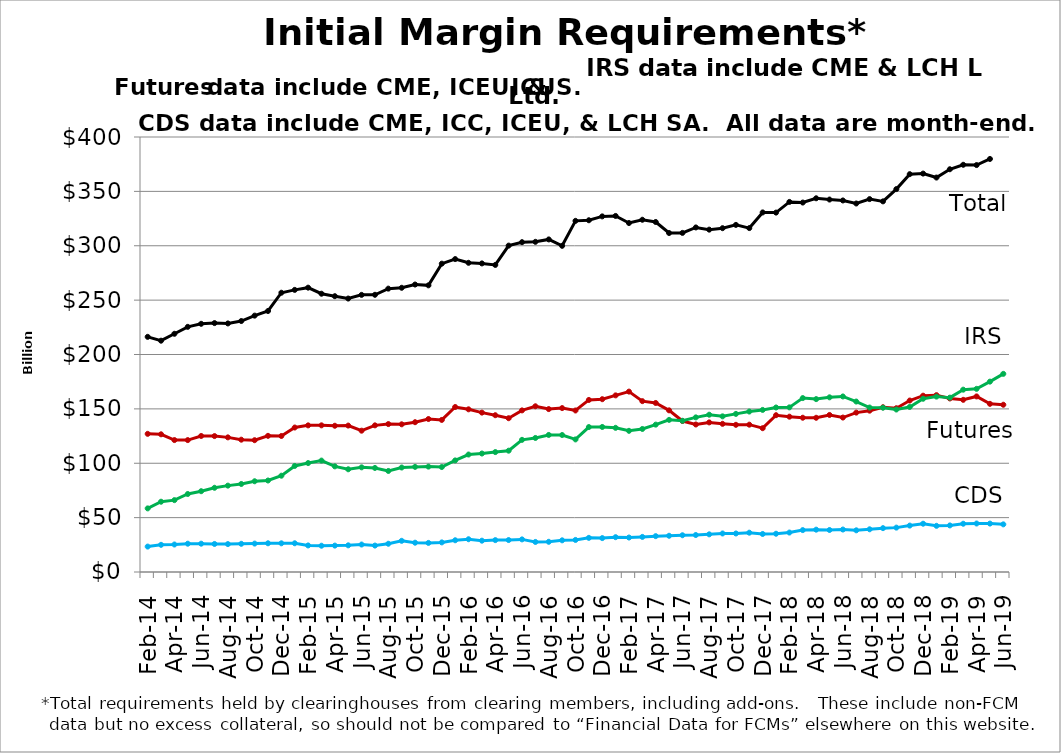
| Category | CDS | Futures | IRS | Total |
|---|---|---|---|---|
| 2014-02-28 |  |  |  |  |
| nan |  |  |  |  |
| 2014-04-30 |  |  |  |  |
| nan |  |  |  |  |
| 2014-06-30 |  |  |  |  |
| nan |  |  |  |  |
| 2014-08-29 |  |  |  |  |
| nan |  |  |  |  |
| 2014-10-31 |  |  |  |  |
| nan |  |  |  |  |
| 2014-12-31 |  |  |  |  |
| nan |  |  |  |  |
| 2015-02-27 |  |  |  |  |
| nan |  |  |  |  |
| 2015-04-30 |  |  |  |  |
| nan |  |  |  |  |
| 2015-06-30 |  |  |  |  |
| nan |  |  |  |  |
| 2015-08-31 |  |  |  |  |
| nan |  |  |  |  |
| 2015-10-30 |  |  |  |  |
| nan |  |  |  |  |
| 2015-12-31 |  |  |  |  |
| nan |  |  |  |  |
| 2016-02-29 |  |  |  |  |
| nan |  |  |  |  |
| 2016-04-29 |  |  |  |  |
| nan |  |  |  |  |
| 2016-06-30 |  |  |  |  |
| nan |  |  |  |  |
| 2016-08-31 |  |  |  |  |
| nan |  |  |  |  |
| 2016-10-31 |  |  |  |  |
| nan |  |  |  |  |
| 2016-12-30 |  |  |  |  |
| nan |  |  |  |  |
| 2017-02-28 |  |  |  |  |
| nan |  |  |  |  |
| 2017-04-28 |  |  |  |  |
| nan |  |  |  |  |
| 2017-06-30 |  |  |  |  |
| nan |  |  |  |  |
| 2017-08-31 |  |  |  |  |
| nan |  |  |  |  |
| 2017-10-31 |  |  |  |  |
| nan |  |  |  |  |
| 2017-12-29 |  |  |  |  |
| nan |  |  |  |  |
| 2018-02-28 |  |  |  |  |
| nan |  |  |  |  |
| 2018-04-30 |  |  |  |  |
| nan |  |  |  |  |
| 2018-06-29 |  |  |  |  |
| nan |  |  |  |  |
| 2018-08-31 |  |  |  |  |
| nan |  |  |  |  |
| 2018-10-31 |  |  |  |  |
| nan |  |  |  |  |
| 2018-12-31 |  |  |  |  |
| nan |  |  |  |  |
| 2019-02-28 |  |  |  |  |
| nan |  |  |  |  |
| 2019-04-30 |  |  |  |  |
| nan |  |  |  |  |
| 2019-06-28 |  |  |  |  |